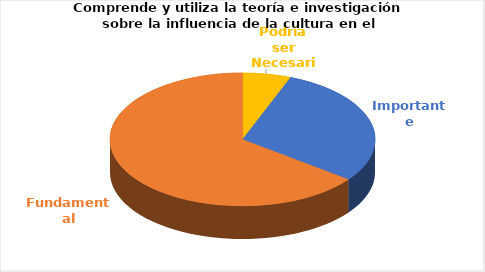
| Category | Series 0 |
|---|---|
| Podría ser Necesaria | 1 |
| Importante | 5 |
| Fundamental | 11 |